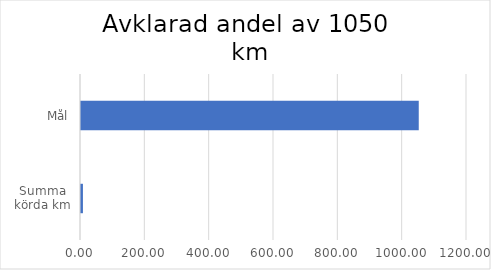
| Category | Series 0 |
|---|---|
| Summa körda km | 6 |
| Mål | 1050 |